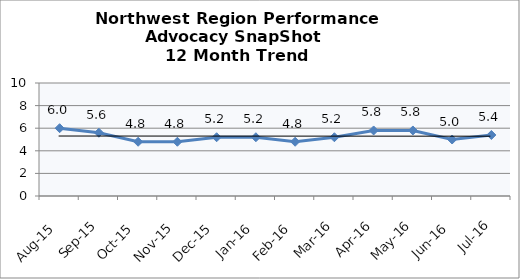
| Category | Northwest Region |
|---|---|
| Aug-15 | 6 |
| Sep-15 | 5.6 |
| Oct-15 | 4.8 |
| Nov-15 | 4.8 |
| Dec-15 | 5.2 |
| Jan-16 | 5.2 |
| Feb-16 | 4.8 |
| Mar-16 | 5.2 |
| Apr-16 | 5.8 |
| May-16 | 5.8 |
| Jun-16 | 5 |
| Jul-16 | 5.4 |